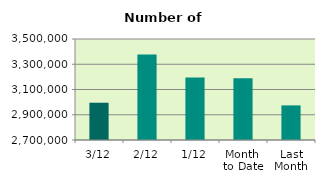
| Category | Series 0 |
|---|---|
| 3/12 | 2995224 |
| 2/12 | 3377688 |
| 1/12 | 3194590 |
| Month 
to Date | 3189167.333 |
| Last
Month | 2974168.364 |